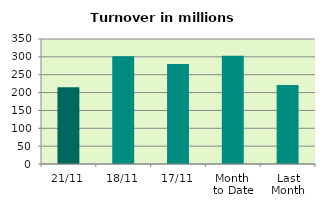
| Category | Series 0 |
|---|---|
| 21/11 | 215.143 |
| 18/11 | 301.9 |
| 17/11 | 279.981 |
| Month 
to Date | 303.065 |
| Last
Month | 221.516 |